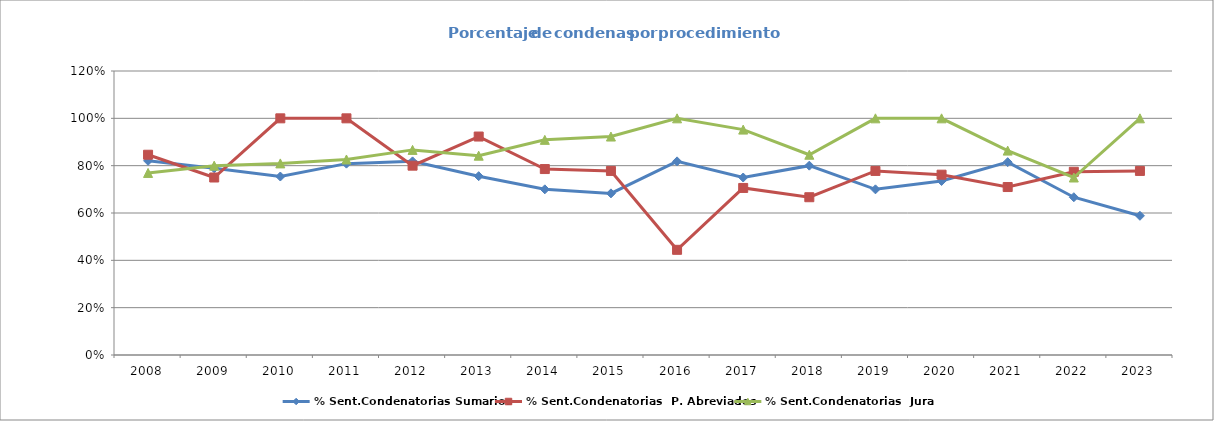
| Category | % Sent.Condenatorias Sumarios | % Sent.Condenatorias  P. Abreviados | % Sent.Condenatorias  Jurado |
|---|---|---|---|
| 2008.0 | 0.821 | 0.846 | 0.769 |
| 2009.0 | 0.789 | 0.75 | 0.8 |
| 2010.0 | 0.754 | 1 | 0.81 |
| 2011.0 | 0.809 | 1 | 0.826 |
| 2012.0 | 0.818 | 0.8 | 0.867 |
| 2013.0 | 0.756 | 0.923 | 0.842 |
| 2014.0 | 0.7 | 0.786 | 0.909 |
| 2015.0 | 0.683 | 0.778 | 0.923 |
| 2016.0 | 0.818 | 0.444 | 1 |
| 2017.0 | 0.75 | 0.706 | 0.952 |
| 2018.0 | 0.8 | 0.667 | 0.846 |
| 2019.0 | 0.7 | 0.778 | 1 |
| 2020.0 | 0.735 | 0.762 | 1 |
| 2021.0 | 0.815 | 0.71 | 0.864 |
| 2022.0 | 0.667 | 0.774 | 0.75 |
| 2023.0 | 0.588 | 0.778 | 1 |